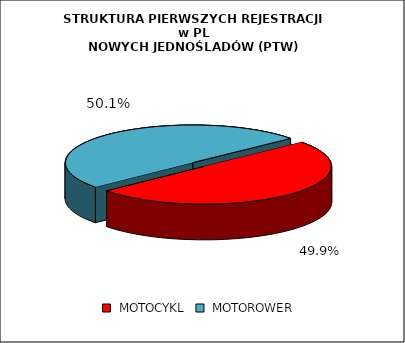
| Category | RAZEM |
|---|---|
|  MOTOCYKL  | 0.499 |
|  MOTOROWER  | 0.501 |